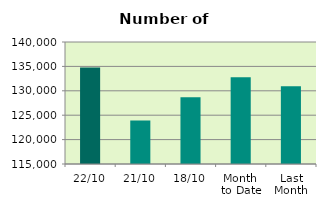
| Category | Series 0 |
|---|---|
| 22/10 | 134774 |
| 21/10 | 123924 |
| 18/10 | 128686 |
| Month 
to Date | 132752.75 |
| Last
Month | 130923.048 |